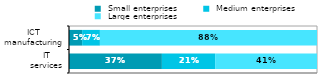
| Category |  Small enterprises |  Medium enterprises |  Large enterprises |
|---|---|---|---|
|  IT 
services | 0.375 | 0.215 | 0.411 |
|  ICT 
manufacturing | 0.053 | 0.072 | 0.875 |